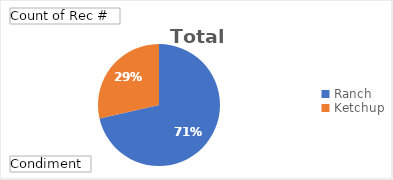
| Category | Total |
|---|---|
| Ranch | 5 |
| Ketchup | 2 |